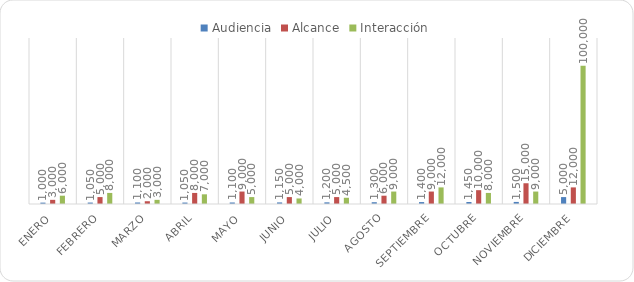
| Category | Audiencia | Alcance | Interacción |
|---|---|---|---|
| Enero | 1000 | 3000 | 6000 |
| Febrero | 1050 | 5000 | 8000 |
| Marzo | 1100 | 2000 | 3000 |
| Abril | 1050 | 8000 | 7000 |
| Mayo | 1100 | 9000 | 5000 |
| Junio | 1150 | 5000 | 4000 |
| Julio | 1200 | 5000 | 4500 |
| Agosto | 1300 | 6000 | 9000 |
| Septiembre | 1400 | 9000 | 12000 |
| Octubre | 1450 | 10000 | 8000 |
| Noviembre | 1500 | 15000 | 9000 |
| Diciembre | 5000 | 12000 | 100000 |